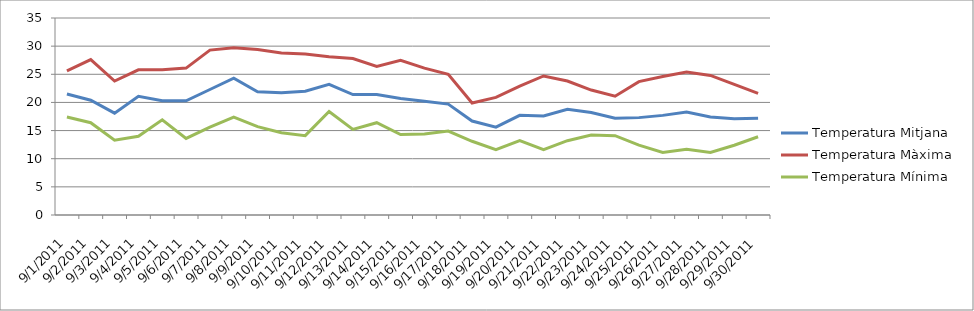
| Category | Temperatura Mitjana | Temperatura Màxima | Temperatura Mínima |
|---|---|---|---|
| 01/09/2011 | 21.5 | 25.6 | 17.4 |
| 02/09/2011 | 20.4 | 27.6 | 16.4 |
| 03/09/2011 | 18.1 | 23.8 | 13.3 |
| 04/09/2011 | 21.1 | 25.8 | 14 |
| 05/09/2011 | 20.3 | 25.8 | 16.9 |
| 06/09/2011 | 20.3 | 26.1 | 13.6 |
| 07/09/2011 | 22.3 | 29.3 | 15.6 |
| 08/09/2011 | 24.3 | 29.7 | 17.4 |
| 09/09/2011 | 21.9 | 29.4 | 15.7 |
| 10/09/2011 | 21.7 | 28.8 | 14.6 |
| 11/09/2011 | 22 | 28.6 | 14.1 |
| 12/09/2011 | 23.2 | 28.1 | 18.4 |
| 13/09/2011 | 21.4 | 27.8 | 15.2 |
| 14/09/2011 | 21.4 | 26.4 | 16.4 |
| 15/09/2011 | 20.7 | 27.5 | 14.3 |
| 16/09/2011 | 20.2 | 26.1 | 14.4 |
| 17/09/2011 | 19.7 | 25 | 14.9 |
| 18/09/2011 | 16.7 | 19.9 | 13.1 |
| 19/09/2011 | 15.6 | 20.9 | 11.6 |
| 20/09/2011 | 17.7 | 22.9 | 13.2 |
| 21/09/2011 | 17.6 | 24.7 | 11.6 |
| 22/09/2011 | 18.8 | 23.8 | 13.2 |
| 23/09/2011 | 18.2 | 22.2 | 14.2 |
| 24/09/2011 | 17.2 | 21.1 | 14.1 |
| 25/09/2011 | 17.3 | 23.7 | 12.4 |
| 26/09/2011 | 17.7 | 24.6 | 11.1 |
| 27/09/2011 | 18.3 | 25.4 | 11.7 |
| 28/09/2011 | 17.4 | 24.8 | 11.1 |
| 29/09/2011 | 17.1 | 23.2 | 12.4 |
| 30/09/2011 | 17.2 | 21.6 | 13.9 |